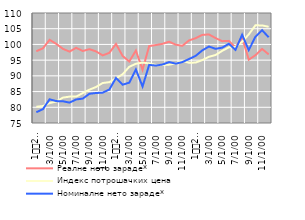
| Category | Реалне нето зараде* | Индекс потрошачких цена | Номиналне нето зараде* |
|---|---|---|---|
| 1
2010. | 97.83 | 80.164 | 78.425 |
| 2 | 98.777 | 80.4 | 79.417 |
| 3 | 101.47 | 81.345 | 82.541 |
| 4 | 100.185 | 81.817 | 81.969 |
| 5 | 98.611 | 83.077 | 81.923 |
| 6 | 97.711 | 83.392 | 81.483 |
| 7 | 98.923 | 83.392 | 82.494 |
| 8 | 97.914 | 84.528 | 82.765 |
| 9 | 98.487 | 85.597 | 84.303 |
| 10 | 97.778 | 86.464 | 84.542 |
| 11 | 96.514 | 87.723 | 84.666 |
| 12 | 97.328 | 87.995 | 85.644 |
| 1
2011. | 100.15 | 89.201 | 89.334 |
| 2 | 96.33 | 90.504 | 87.183 |
| 3 | 94.574 | 92.879 | 87.839 |
| 4 | 98.05 | 93.855 | 92.025 |
| 5 | 91.928 | 94.211 | 86.606 |
| 6 | 99.485 | 93.97 | 93.486 |
| 7 | 99.803 | 93.471 | 93.286 |
| 8 | 100.184 | 93.426 | 93.598 |
| 9 | 100.867 | 93.567 | 94.379 |
| 10 | 99.922 | 93.96 | 93.886 |
| 11 | 99.568 | 94.796 | 94.386 |
| 12 | 101.284 | 94.148 | 95.357 |
| 1
2012. | 101.98 | 94.239 | 96.359 |
| 2 | 103.027 | 95.019 | 98.109 |
| 3 | 103.177 | 96.061 | 99.331 |
| 4 | 102.03 | 96.638 | 98.6 |
| 5 | 101.035 | 97.961 | 98.975 |
| 6 | 101.131 | 99.085 | 100.205 |
| 7 | 99.047 | 99.219 | 98.273 |
| 8 | 102.211 | 100.843 | 103.073 |
| 9 | 95.152 | 103.197 | 98.194 |
| 10 | 96.562 | 106.074 | 102.427 |
| 11 | 98.577 | 106.052 | 104.542 |
| 12 | 96.834 | 105.613 | 102.269 |